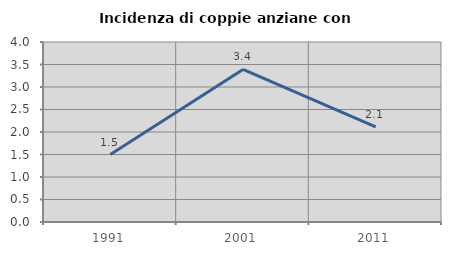
| Category | Incidenza di coppie anziane con figli |
|---|---|
| 1991.0 | 1.5 |
| 2001.0 | 3.39 |
| 2011.0 | 2.113 |